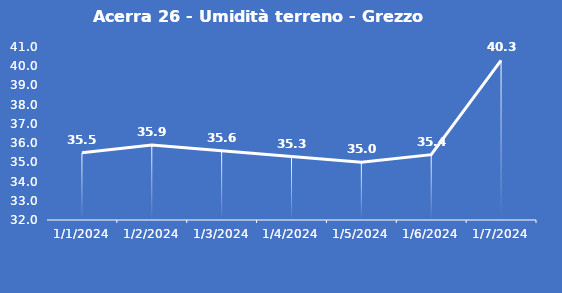
| Category | Acerra 26 - Umidità terreno - Grezzo (%VWC) |
|---|---|
| 1/1/24 | 35.5 |
| 1/2/24 | 35.9 |
| 1/3/24 | 35.6 |
| 1/4/24 | 35.3 |
| 1/5/24 | 35 |
| 1/6/24 | 35.4 |
| 1/7/24 | 40.3 |